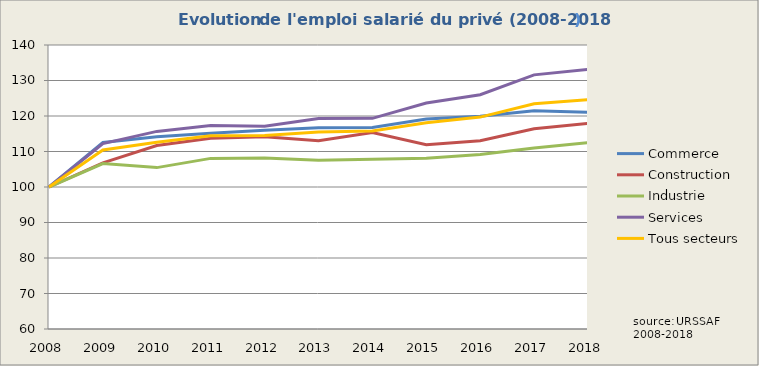
| Category | Commerce | Construction | Industrie | Services | Tous secteurs |
|---|---|---|---|---|---|
| 2008.0 | 100 | 100 | 100 | 100 | 100 |
| 2009.0 | 112.54 | 106.8 | 106.613 | 112.215 | 110.448 |
| 2010.0 | 114.161 | 111.697 | 105.463 | 115.666 | 112.611 |
| 2011.0 | 115.153 | 113.698 | 108.058 | 117.336 | 114.404 |
| 2012.0 | 115.995 | 114.174 | 108.169 | 117.109 | 114.521 |
| 2013.0 | 116.696 | 112.998 | 107.519 | 119.321 | 115.461 |
| 2014.0 | 116.732 | 115.363 | 107.802 | 119.346 | 115.768 |
| 2015.0 | 119.174 | 111.893 | 108.124 | 123.67 | 118.071 |
| 2016.0 | 119.925 | 113.054 | 109.158 | 125.99 | 119.689 |
| 2017.0 | 121.483 | 116.398 | 110.992 | 131.591 | 123.442 |
| 2018.0 | 121.051 | 117.896 | 112.509 | 133.147 | 124.616 |